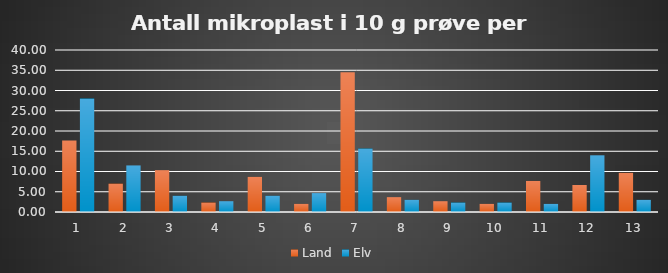
| Category | Land | Elv |
|---|---|---|
| 1.0 | 17.667 | 28 |
| 2.0 | 7 | 11.5 |
| 3.0 | 10.333 | 4 |
| 4.0 | 2.333 | 2.667 |
| 5.0 | 8.667 | 4 |
| 6.0 | 2 | 4.667 |
| 7.0 | 34.5 | 15.667 |
| 8.0 | 3.667 | 3 |
| 9.0 | 2.667 | 2.333 |
| 10.0 | 2 | 2.333 |
| 11.0 | 7.667 | 2 |
| 12.0 | 6.667 | 14 |
| 13.0 | 9.667 | 3 |